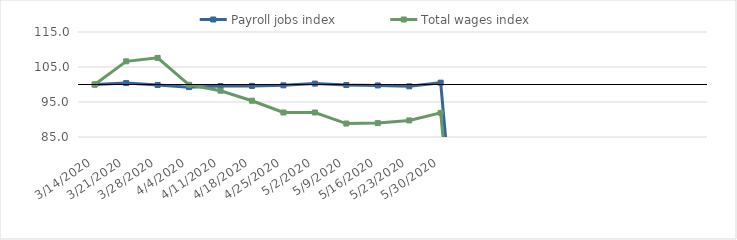
| Category | Payroll jobs index | Total wages index |
|---|---|---|
| 14/03/2020 | 100 | 100 |
| 21/03/2020 | 100.406 | 106.617 |
| 28/03/2020 | 99.862 | 107.607 |
| 04/04/2020 | 99.249 | 99.916 |
| 11/04/2020 | 99.555 | 98.224 |
| 18/04/2020 | 99.605 | 95.365 |
| 25/04/2020 | 99.77 | 92.002 |
| 02/05/2020 | 100.25 | 92.004 |
| 09/05/2020 | 99.861 | 88.845 |
| 16/05/2020 | 99.729 | 88.968 |
| 23/05/2020 | 99.483 | 89.737 |
| 30/05/2020 | 100.523 | 91.914 |